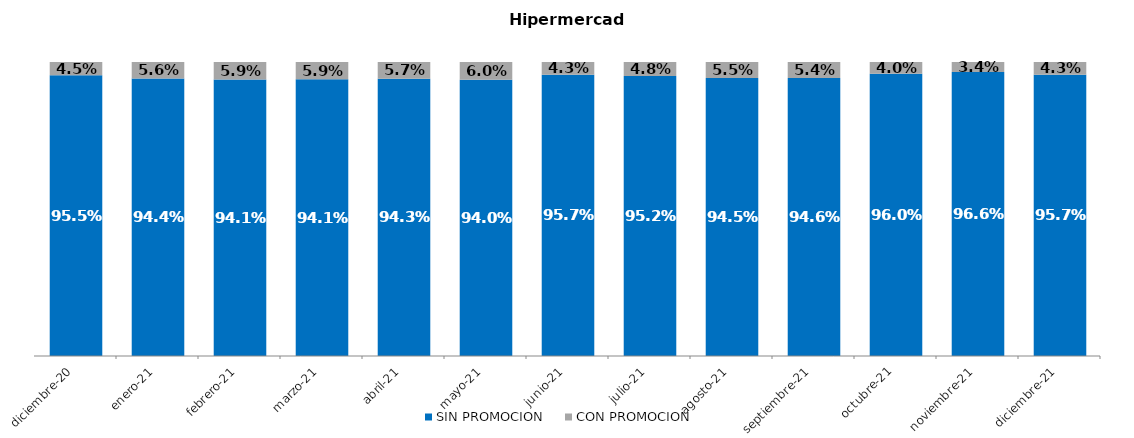
| Category | SIN PROMOCION   | CON PROMOCION   |
|---|---|---|
| 2020-12-01 | 0.955 | 0.045 |
| 2021-01-01 | 0.944 | 0.056 |
| 2021-02-01 | 0.941 | 0.059 |
| 2021-03-01 | 0.941 | 0.059 |
| 2021-04-01 | 0.943 | 0.057 |
| 2021-05-01 | 0.94 | 0.06 |
| 2021-06-01 | 0.957 | 0.043 |
| 2021-07-01 | 0.952 | 0.048 |
| 2021-08-01 | 0.945 | 0.055 |
| 2021-09-01 | 0.946 | 0.054 |
| 2021-10-01 | 0.96 | 0.04 |
| 2021-11-01 | 0.966 | 0.034 |
| 2021-12-01 | 0.957 | 0.043 |